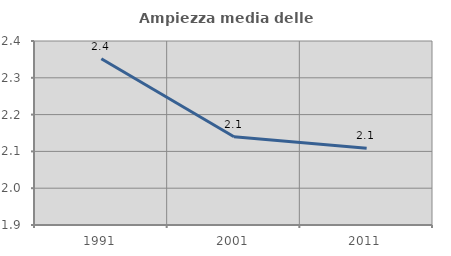
| Category | Ampiezza media delle famiglie |
|---|---|
| 1991.0 | 2.352 |
| 2001.0 | 2.14 |
| 2011.0 | 2.109 |